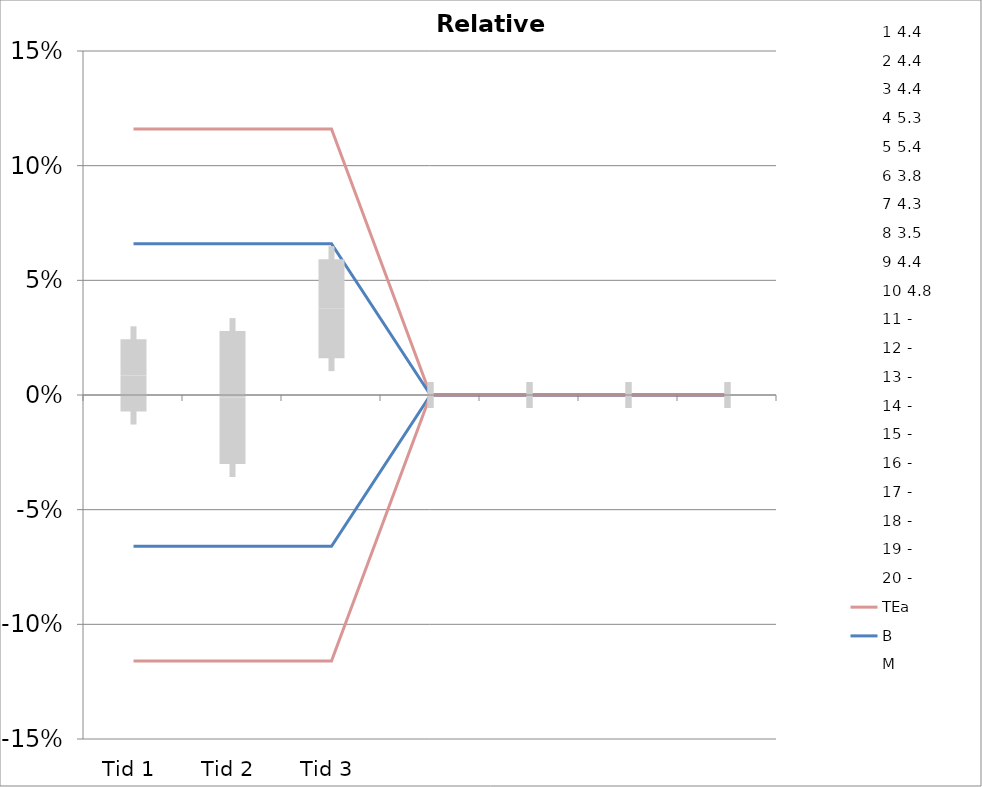
| Category | 1 | 2 | 3 | 4 | 5 | 6 | 7 | 8 | 9 | 10 | 11 | 12 | 13 | 14 | 15 | 16 | 17 | 18 | 19 | 20 | TEa | B | -B | -TEa | M |
|---|---|---|---|---|---|---|---|---|---|---|---|---|---|---|---|---|---|---|---|---|---|---|---|---|---|
| Tid 1 | 0.005 | 0.023 | 0.011 | 0.019 | -0.022 | 0.05 | 0.007 | -0.009 | -0.021 | 0.023 | 0 | 0 | 0 | 0 | 0 | 0 | 0 | 0 | 0 | 0 | 0.116 | 0.066 | -0.066 | -0.116 | 0.009 |
| Tid 2 | 0.014 | -0.052 | 0.016 | -0.019 | 0.007 | 0.079 | -0.053 | 0.032 | -0.034 | 0 | 0 | 0 | 0 | 0 | 0 | 0 | 0 | 0 | 0 | 0 | 0.116 | 0.066 | -0.066 | -0.116 | -0.001 |
| Tid 3 | 0.014 | 0.061 | 0 | 0.019 | 0.045 | 0.079 | 0.039 | 0.032 | -0.011 | 0.062 | 0 | 0 | 0 | 0 | 0 | 0 | 0 | 0 | 0 | 0 | 0.116 | 0.066 | -0.066 | -0.116 | 0.038 |